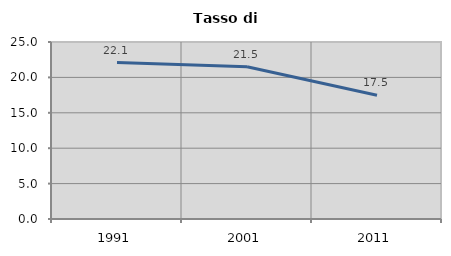
| Category | Tasso di disoccupazione   |
|---|---|
| 1991.0 | 22.104 |
| 2001.0 | 21.503 |
| 2011.0 | 17.476 |